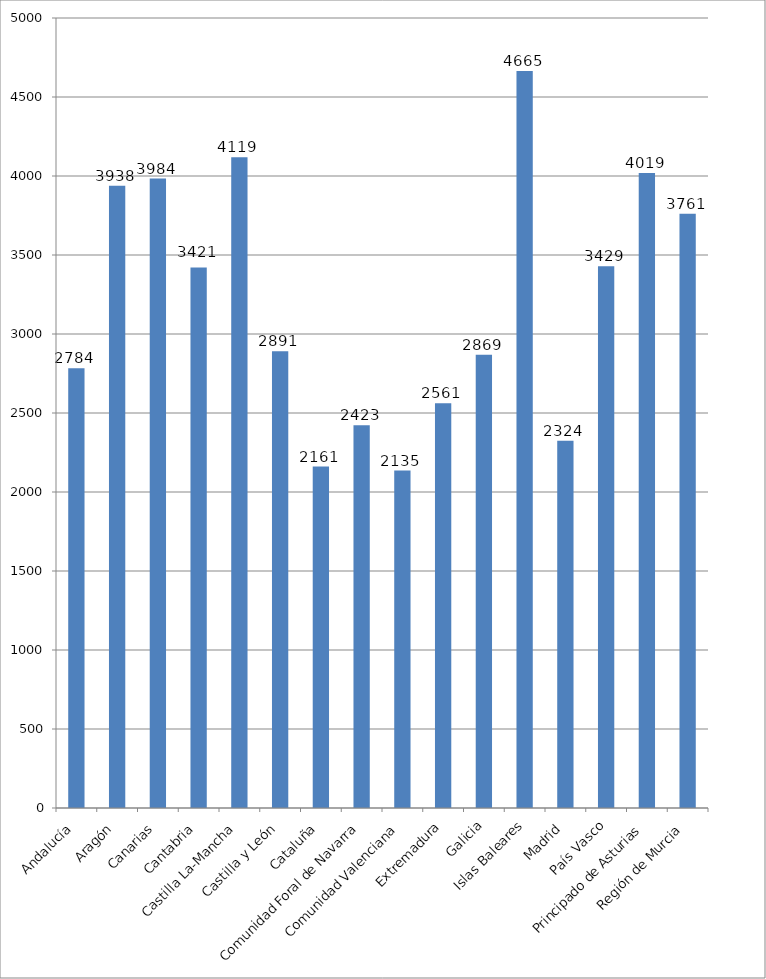
| Category | Total |
|---|---|
| Andalucía | 2783.667 |
| Aragón | 3938 |
| Canarias | 3983.5 |
| Cantabria | 3420.5 |
| Castilla La-Mancha | 4119.333 |
| Castilla y León | 2891.125 |
| Cataluña | 2161.13 |
| Comunidad Foral de Navarra | 2422.667 |
| Comunidad Valenciana | 2135.385 |
| Extremadura | 2561 |
| Galicia | 2868.75 |
| Islas Baleares | 4664.667 |
| Madrid | 2323.9 |
| País Vasco | 3429 |
| Principado de Asturias | 4018.5 |
| Región de Murcia | 3761.333 |